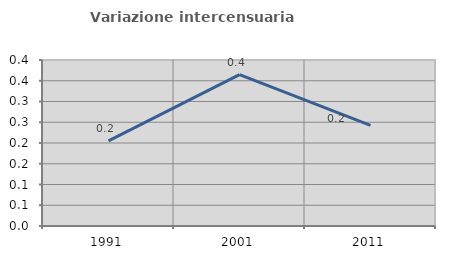
| Category | Variazione intercensuaria annua |
|---|---|
| 1991.0 | 0.205 |
| 2001.0 | 0.365 |
| 2011.0 | 0.243 |